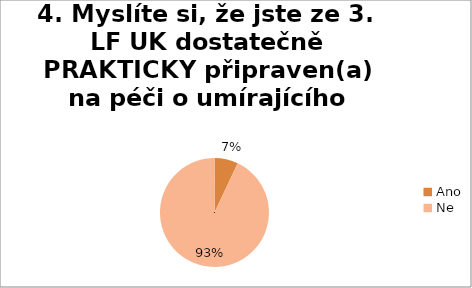
| Category | 4. Myslíte si, že jste ze 3. LF UK dostatečně PRAKTICKY připraven(a) na péči o umírajícího pacienta?  |
|---|---|
| Ano | 0.07 |
| Ne | 0.93 |